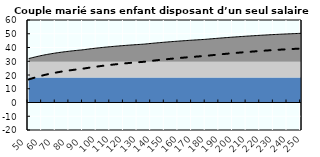
| Category | Coin fiscal moyen (somme des composantes) | Taux moyen d'imposition net en % du salaire brut |
|---|---|---|
| 50.0 | 31.943 | 16.773 |
| 51.0 | 32.201 | 17.088 |
| 52.0 | 32.448 | 17.391 |
| 53.0 | 32.686 | 17.682 |
| 54.0 | 32.92 | 17.968 |
| 55.0 | 33.166 | 18.269 |
| 56.0 | 33.404 | 18.56 |
| 57.0 | 33.633 | 18.84 |
| 58.0 | 33.855 | 19.111 |
| 59.0 | 34.069 | 19.372 |
| 60.0 | 34.275 | 19.625 |
| 61.0 | 34.475 | 19.87 |
| 62.0 | 34.669 | 20.106 |
| 63.0 | 34.856 | 20.335 |
| 64.0 | 35.038 | 20.557 |
| 65.0 | 35.213 | 20.773 |
| 66.0 | 35.384 | 20.981 |
| 67.0 | 35.55 | 21.184 |
| 68.0 | 35.71 | 21.38 |
| 69.0 | 35.866 | 21.571 |
| 70.0 | 36.018 | 21.756 |
| 71.0 | 36.165 | 21.936 |
| 72.0 | 36.308 | 22.111 |
| 73.0 | 36.447 | 22.281 |
| 74.0 | 36.583 | 22.447 |
| 75.0 | 36.715 | 22.608 |
| 76.0 | 36.843 | 22.765 |
| 77.0 | 36.968 | 22.918 |
| 78.0 | 37.09 | 23.067 |
| 79.0 | 37.209 | 23.213 |
| 80.0 | 37.325 | 23.354 |
| 81.0 | 37.437 | 23.492 |
| 82.0 | 37.548 | 23.627 |
| 83.0 | 37.655 | 23.759 |
| 84.0 | 37.76 | 23.887 |
| 85.0 | 37.863 | 24.012 |
| 86.0 | 37.963 | 24.135 |
| 87.0 | 38.061 | 24.254 |
| 88.0 | 38.156 | 24.371 |
| 89.0 | 38.25 | 24.485 |
| 90.0 | 38.355 | 24.615 |
| 91.0 | 38.491 | 24.781 |
| 92.0 | 38.624 | 24.943 |
| 93.0 | 38.754 | 25.102 |
| 94.0 | 38.881 | 25.257 |
| 95.0 | 39.005 | 25.409 |
| 96.0 | 39.127 | 25.558 |
| 97.0 | 39.246 | 25.704 |
| 98.0 | 39.363 | 25.847 |
| 99.0 | 39.478 | 25.987 |
| 100.0 | 39.59 | 26.124 |
| 101.0 | 39.7 | 26.259 |
| 102.0 | 39.808 | 26.391 |
| 103.0 | 39.913 | 26.52 |
| 104.0 | 40.017 | 26.647 |
| 105.0 | 40.119 | 26.771 |
| 106.0 | 40.219 | 26.893 |
| 107.0 | 40.316 | 27.013 |
| 108.0 | 40.413 | 27.131 |
| 109.0 | 40.507 | 27.246 |
| 110.0 | 40.6 | 27.359 |
| 111.0 | 40.691 | 27.471 |
| 112.0 | 40.78 | 27.58 |
| 113.0 | 40.868 | 27.687 |
| 114.0 | 40.954 | 27.793 |
| 115.0 | 41.039 | 27.896 |
| 116.0 | 41.122 | 27.998 |
| 117.0 | 41.204 | 28.098 |
| 118.0 | 41.284 | 28.197 |
| 119.0 | 41.363 | 28.293 |
| 120.0 | 41.441 | 28.388 |
| 121.0 | 41.518 | 28.482 |
| 122.0 | 41.593 | 28.574 |
| 123.0 | 41.667 | 28.665 |
| 124.0 | 41.74 | 28.754 |
| 125.0 | 41.811 | 28.841 |
| 126.0 | 41.882 | 28.927 |
| 127.0 | 41.951 | 29.012 |
| 128.0 | 42.02 | 29.096 |
| 129.0 | 42.087 | 29.178 |
| 130.0 | 42.153 | 29.259 |
| 131.0 | 42.218 | 29.339 |
| 132.0 | 42.283 | 29.418 |
| 133.0 | 42.346 | 29.495 |
| 134.0 | 42.408 | 29.571 |
| 135.0 | 42.489 | 29.67 |
| 136.0 | 42.591 | 29.794 |
| 137.0 | 42.691 | 29.917 |
| 138.0 | 42.79 | 30.038 |
| 139.0 | 42.887 | 30.157 |
| 140.0 | 42.983 | 30.274 |
| 141.0 | 43.078 | 30.39 |
| 142.0 | 43.171 | 30.504 |
| 143.0 | 43.264 | 30.617 |
| 144.0 | 43.354 | 30.728 |
| 145.0 | 43.444 | 30.837 |
| 146.0 | 43.532 | 30.945 |
| 147.0 | 43.619 | 31.052 |
| 148.0 | 43.705 | 31.157 |
| 149.0 | 43.79 | 31.261 |
| 150.0 | 43.873 | 31.363 |
| 151.0 | 43.956 | 31.464 |
| 152.0 | 44.037 | 31.563 |
| 153.0 | 44.118 | 31.662 |
| 154.0 | 44.197 | 31.759 |
| 155.0 | 44.275 | 31.854 |
| 156.0 | 44.353 | 31.949 |
| 157.0 | 44.429 | 32.042 |
| 158.0 | 44.504 | 32.134 |
| 159.0 | 44.579 | 32.225 |
| 160.0 | 44.652 | 32.315 |
| 161.0 | 44.725 | 32.404 |
| 162.0 | 44.796 | 32.491 |
| 163.0 | 44.867 | 32.578 |
| 164.0 | 44.937 | 32.663 |
| 165.0 | 45.006 | 32.748 |
| 166.0 | 45.074 | 32.831 |
| 167.0 | 45.142 | 32.914 |
| 168.0 | 45.208 | 32.995 |
| 169.0 | 45.274 | 33.076 |
| 170.0 | 45.339 | 33.155 |
| 171.0 | 45.404 | 33.234 |
| 172.0 | 45.467 | 33.312 |
| 173.0 | 45.53 | 33.388 |
| 174.0 | 45.592 | 33.464 |
| 175.0 | 45.653 | 33.539 |
| 176.0 | 45.714 | 33.614 |
| 177.0 | 45.774 | 33.687 |
| 178.0 | 45.833 | 33.76 |
| 179.0 | 45.892 | 33.831 |
| 180.0 | 45.969 | 33.926 |
| 181.0 | 46.058 | 34.034 |
| 182.0 | 46.145 | 34.141 |
| 183.0 | 46.232 | 34.247 |
| 184.0 | 46.317 | 34.351 |
| 185.0 | 46.402 | 34.455 |
| 186.0 | 46.485 | 34.557 |
| 187.0 | 46.568 | 34.658 |
| 188.0 | 46.65 | 34.758 |
| 189.0 | 46.731 | 34.857 |
| 190.0 | 46.811 | 34.955 |
| 191.0 | 46.891 | 35.053 |
| 192.0 | 46.969 | 35.149 |
| 193.0 | 47.047 | 35.244 |
| 194.0 | 47.124 | 35.338 |
| 195.0 | 47.2 | 35.431 |
| 196.0 | 47.275 | 35.523 |
| 197.0 | 47.35 | 35.614 |
| 198.0 | 47.424 | 35.704 |
| 199.0 | 47.497 | 35.794 |
| 200.0 | 47.569 | 35.882 |
| 201.0 | 47.641 | 35.97 |
| 202.0 | 47.712 | 36.057 |
| 203.0 | 47.782 | 36.142 |
| 204.0 | 47.851 | 36.227 |
| 205.0 | 47.92 | 36.312 |
| 206.0 | 47.988 | 36.395 |
| 207.0 | 48.056 | 36.478 |
| 208.0 | 48.123 | 36.559 |
| 209.0 | 48.189 | 36.64 |
| 210.0 | 48.255 | 36.721 |
| 211.0 | 48.32 | 36.8 |
| 212.0 | 48.384 | 36.879 |
| 213.0 | 48.448 | 36.957 |
| 214.0 | 48.511 | 37.034 |
| 215.0 | 48.574 | 37.111 |
| 216.0 | 48.636 | 37.186 |
| 217.0 | 48.697 | 37.262 |
| 218.0 | 48.758 | 37.336 |
| 219.0 | 48.818 | 37.41 |
| 220.0 | 48.878 | 37.483 |
| 221.0 | 48.937 | 37.555 |
| 222.0 | 48.996 | 37.627 |
| 223.0 | 49.054 | 37.698 |
| 224.0 | 49.112 | 37.769 |
| 225.0 | 49.169 | 37.839 |
| 226.0 | 49.226 | 37.908 |
| 227.0 | 49.282 | 37.977 |
| 228.0 | 49.337 | 38.045 |
| 229.0 | 49.387 | 38.105 |
| 230.0 | 49.435 | 38.164 |
| 231.0 | 49.483 | 38.223 |
| 232.0 | 49.531 | 38.281 |
| 233.0 | 49.578 | 38.339 |
| 234.0 | 49.625 | 38.397 |
| 235.0 | 49.672 | 38.454 |
| 236.0 | 49.718 | 38.51 |
| 237.0 | 49.764 | 38.566 |
| 238.0 | 49.809 | 38.621 |
| 239.0 | 49.854 | 38.676 |
| 240.0 | 49.899 | 38.731 |
| 241.0 | 49.943 | 38.785 |
| 242.0 | 49.987 | 38.839 |
| 243.0 | 50.03 | 38.892 |
| 244.0 | 50.073 | 38.945 |
| 245.0 | 50.116 | 38.997 |
| 246.0 | 50.159 | 39.049 |
| 247.0 | 50.201 | 39.1 |
| 248.0 | 50.242 | 39.152 |
| 249.0 | 50.284 | 39.202 |
| 250.0 | 50.325 | 39.252 |